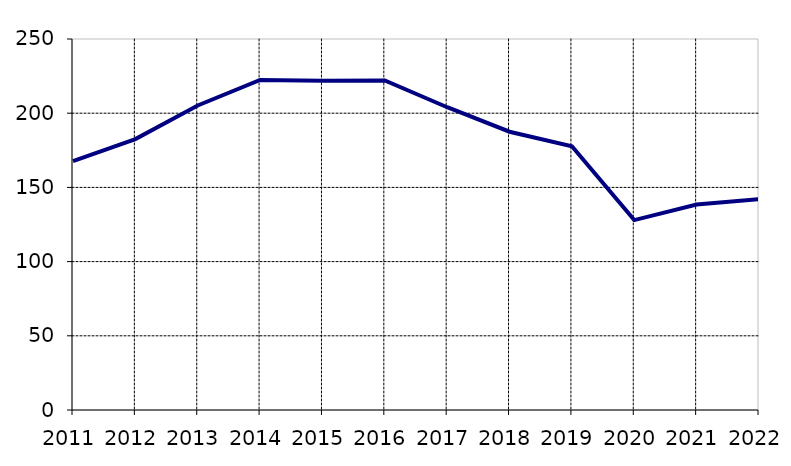
| Category | Series 0 |
|---|---|
| 2011 | 167.764 |
| 2012 | 182.525 |
| 2013 | 205.216 |
| 2014 | 222.414 |
| 2015 | 221.807 |
| 2016 | 222.109 |
| 2017 | 204.024 |
| 2018 | 187.51 |
| 2019 | 177.746 |
| 2020 | 127.964 |
| 2021 | 138.437 |
| 2022 | 142.141 |